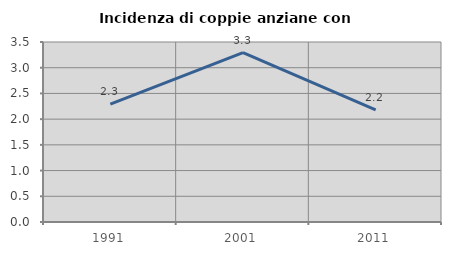
| Category | Incidenza di coppie anziane con figli |
|---|---|
| 1991.0 | 2.29 |
| 2001.0 | 3.294 |
| 2011.0 | 2.179 |